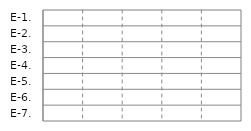
| Category | IN | OUT |
|---|---|---|
| E-1. | 0 | 0 |
| E-2. | 0 | 0 |
| E-3. | 0 | 0 |
| E-4. | 0 | 0 |
| E-5. | 0 | 0 |
| E-6. | 0 | 0 |
| E-7. | 0 | 0 |